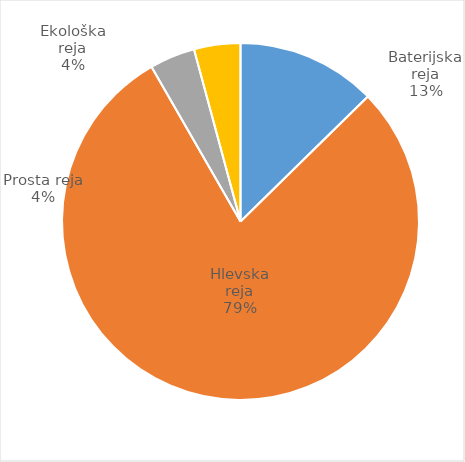
| Category | Število kosov jajc |
|---|---|
| Baterijska reja | 308550 |
| Hlevska reja | 1928193 |
| Prosta reja | 100350 |
| Ekološka reja | 102380 |